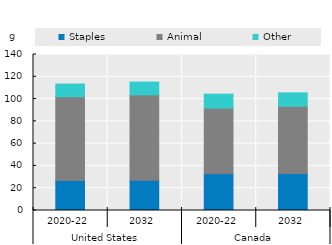
| Category | Staples | Animal | Other |
|---|---|---|---|
| 0 | 27.026 | 75.088 | 11.387 |
| 1 | 27.075 | 76.741 | 11.372 |
| 2 | 33.06 | 58.832 | 12.501 |
| 3 | 33.097 | 60.52 | 11.939 |